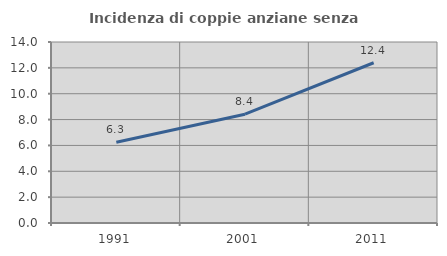
| Category | Incidenza di coppie anziane senza figli  |
|---|---|
| 1991.0 | 6.25 |
| 2001.0 | 8.419 |
| 2011.0 | 12.396 |